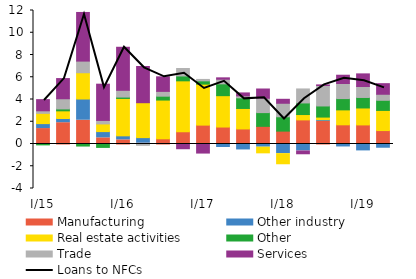
| Category | Manufacturing | Other industry | Real estate activities | Other | Trade | Services |
|---|---|---|---|---|---|---|
| I/15 | 1.388 | 0.445 | 0.922 | -0.079 | 0.229 | 1.003 |
| II | 1.916 | 0.374 | 0.691 | 0.172 | 0.915 | 1.814 |
| III | 2.137 | 1.906 | 2.363 | -0.183 | 1.046 | 4.372 |
| IV | 0.552 | 0.562 | 0.688 | -0.307 | 0.316 | 3.259 |
| I/16 | 0.372 | 0.362 | 3.359 | 0.125 | 0.608 | 3.869 |
| II | 0.072 | 0.502 | 3.138 | -0.03 | -0.089 | 3.256 |
| III | 0.454 | 0.013 | 3.483 | 0.349 | 0.432 | 1.308 |
| IV | 1.093 | 0.006 | 4.578 | 0.438 | 0.669 | -0.424 |
| I/17 | 1.697 | -0.007 | 3.685 | 0.293 | 0.129 | -0.807 |
| II | 1.525 | -0.317 | 2.819 | 1.064 | 0.413 | 0.125 |
| III | 1.353 | -0.534 | 1.841 | 0.958 | 0.173 | 0.267 |
| IV | 1.588 | -0.285 | -0.51 | 1.234 | 1.291 | 0.831 |
| I/18 | 1.158 | -0.865 | -0.911 | 1.288 | 1.216 | 0.357 |
| II | 2.167 | -0.624 | 0.481 | 1.042 | 1.258 | -0.254 |
| III | 2.025 | 0.159 | 0.235 | 0.999 | 1.841 | 0.054 |
| IV | 1.724 | -0.266 | 1.343 | 1.015 | 1.358 | 0.742 |
| I/19 | 1.715 | -0.621 | 1.524 | 0.943 | 0.986 | 1.134 |
| II | 1.207 | -0.381 | 1.811 | 0.911 | 0.542 | 0.952 |